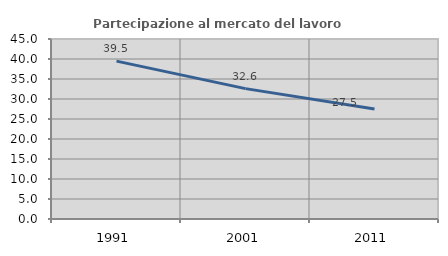
| Category | Partecipazione al mercato del lavoro  femminile |
|---|---|
| 1991.0 | 39.465 |
| 2001.0 | 32.597 |
| 2011.0 | 27.484 |